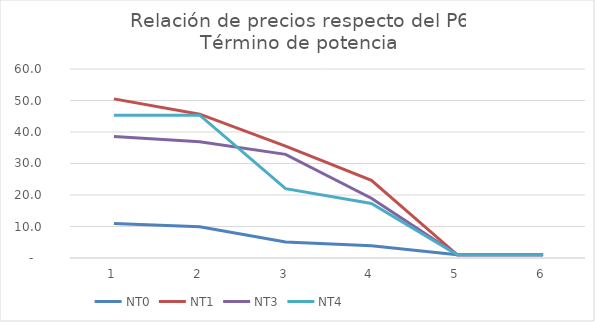
| Category | NT0 | NT1 | NT3 | NT4 |
|---|---|---|---|---|
| 0 | 10.936 | 50.522 | 38.559 | 45.341 |
| 1 | 9.951 | 45.662 | 36.894 | 45.341 |
| 2 | 5.059 | 35.539 | 32.906 | 22.011 |
| 3 | 3.858 | 24.632 | 18.96 | 17.332 |
| 4 | 1 | 1 | 1 | 1 |
| 5 | 1 | 1 | 1 | 1 |